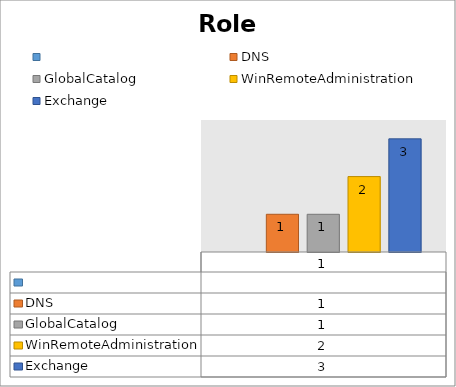
| Category | Series 0 | DNS | GlobalCatalog | WinRemoteAdministration | Exchange |
|---|---|---|---|---|---|
| 0 |  | 1 | 1 | 2 | 3 |